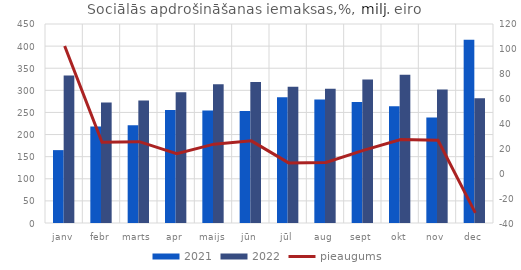
| Category | 2021 | 2022 |
|---|---|---|
| janv | 164.8 | 333.477 |
| febr | 218.091 | 272.477 |
| marts | 220.95 | 277.094 |
| apr | 255.257 | 295.571 |
| maijs | 254.326 | 313.846 |
| jūn | 253.083 | 318.981 |
| jūl | 284.509 | 308.24 |
| aug | 279.485 | 303.844 |
| sept | 273.9 | 324.386 |
| okt | 263.764 | 335.206 |
| nov | 238.667 | 301.93 |
| dec | 414.233 | 282.163 |